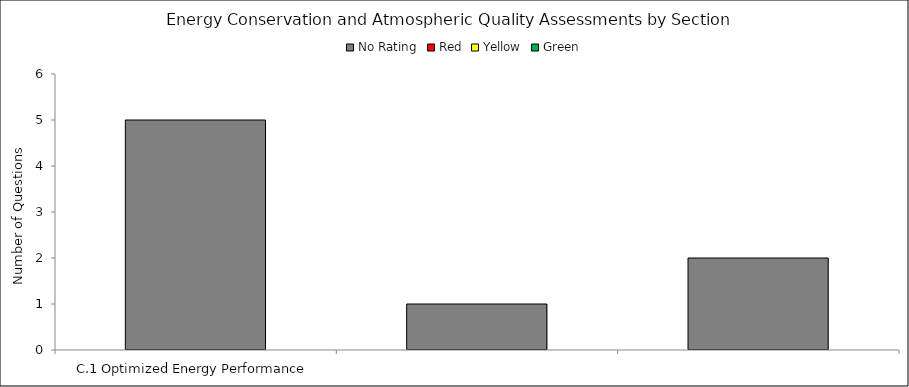
| Category | No Rating | Red | Yellow | Green |
|---|---|---|---|---|
| C.1 Optimized Energy Performance | 5 | 0 | 0 | 0 |
| C.2 On-Site Renewable Energy | 1 | 0 | 0 | 0 |
| C.3 Atmospheric Quality Protection | 2 | 0 | 0 | 0 |